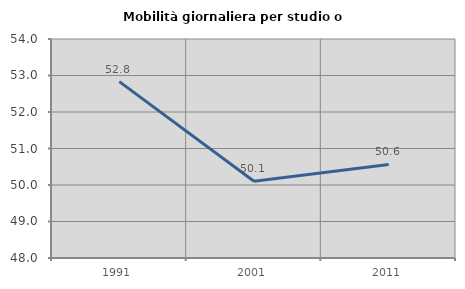
| Category | Mobilità giornaliera per studio o lavoro |
|---|---|
| 1991.0 | 52.832 |
| 2001.0 | 50.103 |
| 2011.0 | 50.564 |